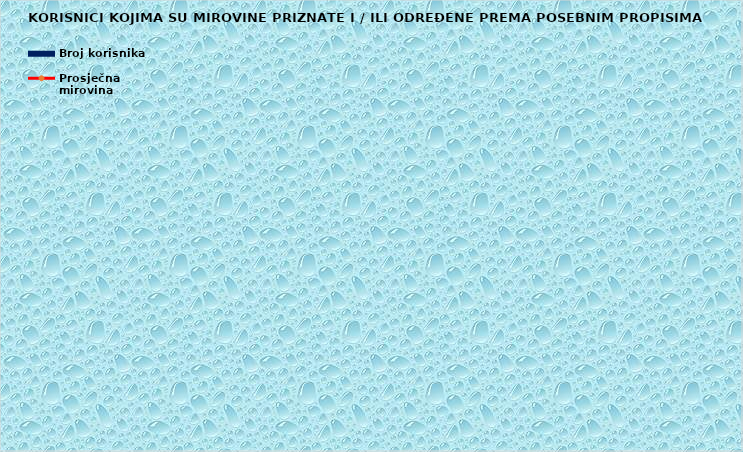
| Category | Broj korisnika |
|---|---|
|      a) radnici na poslovima ovlaštenih službenih osoba u tijelima unutarnjih 
poslova i pravosuđa, kojima je pravo na mirovinu priznato prema propisima
koji su bili na snazi do stupanja na snagu Zakona o pravima iz mirovinskog
osiguranja DVO, PS i OSO | 8264 |
|      b) radnici na  poslovima policijskih službenika, ovlaštenih službenih osoba pravosuđa i službene osobe s posebnim dužnostima i ovlastima u sigurnosno obavještajnom sustavu RH koji su pravo na mirovinu ostvarili prema Zakonu o pravima DVO, PS i OSO | 8611 |
|      c) radnici na poslovima razminiranja | 592 |
| Korisnici koji pravo na mirovinu ostvaruju prema Zakonu o vatrogastvu (NN 125/19)* | 63 |
| Djelatne vojne osobe - DVO  | 15856 |
| Pripadnici Hrvatske domovinske vojske od 1941. do 1945. godine | 3428 |
| Bivši politički zatvorenici | 2644 |
| Hrvatski branitelji iz Domovinskog rata - ZOHBDR | 71032 |
| Mirovine priznate prema općim propisima, a određene prema
ZOHBDR - u iz 2017. (čl. 27., 35., 48. i 49. stavak 2.)  | 46472 |
| Pripadnici bivše Jugoslavenske narodne armije - JNA | 4972 |
| Pripadnici bivše Jugoslavenske narodne armije - JNA - čl. 185 ZOMO | 157 |
| Sudionici Narodnooslobodilačkog rata - NOR | 8319 |
| Zastupnici u Hrvatskom saboru, članovi Vlade, suci Ustavnog suda i glavni državni revizor  | 685 |
| Članovi Izvršnog vijeća Sabora, Saveznog izvršnog vijeća i administrativno umirovljeni javni službenici | 88 |
| Bivši službenici u saveznim tijelima bivše SFRJ - članak 38. ZOMO | 32 |
| Redoviti članovi Hrvatske akademije znanosti i umjetnosti - HAZU | 137 |
| Radnici u Istarskim ugljenokopima "Tupljak" d.d. Labin  | 253 |
| Radnici profesionalno izloženi azbestu | 858 |
| Osiguranici - članovi posade broda u međunarodnoj plovidbi i nacionalnoj plovidbi - članak 129. a stavak 2. Pomorskog zakonika | 189 |
| Pripadnici Hrvatskog vijeća obrane  - HVO  | 6778 |